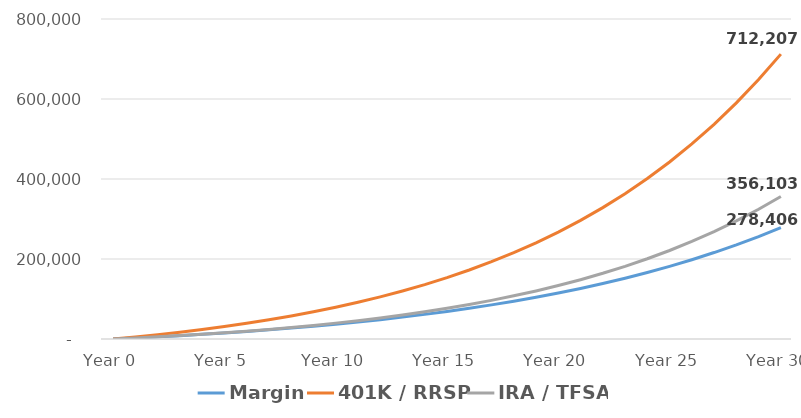
| Category | Margin | 401K / RRSP | IRA / TFSA |
|---|---|---|---|
| Year 0 | 0 | 0 | 0 |
| Year 1 | 2596.25 | 5225 | 2612.5 |
| Year 2 | 5392.411 | 10920.25 | 5460.125 |
| Year 3 | 8403.877 | 17128.072 | 8564.036 |
| Year 4 | 11647.225 | 23894.599 | 11947.3 |
| Year 5 | 15140.312 | 31270.113 | 15635.056 |
| Year 6 | 18902.366 | 39309.423 | 19654.712 |
| Year 7 | 22954.098 | 48072.271 | 24036.136 |
| Year 8 | 27317.814 | 57623.776 | 28811.888 |
| Year 9 | 32017.535 | 68034.915 | 34017.458 |
| Year 10 | 37079.135 | 79383.058 | 39691.529 |
| Year 11 | 42530.479 | 91752.533 | 45876.266 |
| Year 12 | 48401.576 | 105235.261 | 52617.63 |
| Year 13 | 54724.747 | 119931.434 | 59965.717 |
| Year 14 | 61534.802 | 135950.264 | 67975.132 |
| Year 15 | 68869.232 | 153410.787 | 76705.394 |
| Year 16 | 76768.413 | 172442.758 | 86221.379 |
| Year 17 | 85275.831 | 193187.606 | 96593.803 |
| Year 18 | 94438.32 | 215799.491 | 107899.745 |
| Year 19 | 104306.321 | 240446.445 | 120223.223 |
| Year 20 | 114934.157 | 267311.625 | 133655.813 |
| Year 21 | 126380.337 | 296594.671 | 148297.336 |
| Year 22 | 138707.873 | 328513.192 | 164256.596 |
| Year 23 | 151984.63 | 363304.379 | 181652.19 |
| Year 24 | 166283.696 | 401226.773 | 200613.387 |
| Year 25 | 181683.791 | 442562.183 | 221281.091 |
| Year 26 | 198269.693 | 487617.779 | 243808.89 |
| Year 27 | 216132.709 | 536728.379 | 268364.19 |
| Year 28 | 235371.178 | 590258.934 | 295129.467 |
| Year 29 | 256091.008 | 648607.238 | 324303.619 |
| Year 30 | 278406.266 | 712206.889 | 356103.444 |